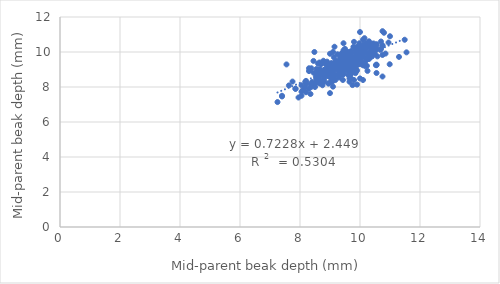
| Category | Mid-offspring beak depth (mm) |
|---|---|
| 10.1 | 10.7 |
| 9.55 | 9.78 |
| 9.4 | 9.48 |
| 10.25 | 9.6 |
| 10.13 | 10.27 |
| 9.7 | 9.5 |
| 9.05 | 9 |
| 7.4 | 7.46 |
| 9.0 | 7.65 |
| 8.65 | 8.63 |
| 9.63 | 9.81 |
| 9.9 | 9.4 |
| 9.55 | 9.48 |
| 9.05 | 8.75 |
| 8.35 | 7.6 |
| 10.1 | 10 |
| 10.1 | 10.09 |
| 9.9 | 9.74 |
| 10.23 | 9.64 |
| 10.0 | 8.49 |
| 10.55 | 10.15 |
| 10.45 | 10.28 |
| 9.2 | 9.2 |
| 10.2 | 10.01 |
| 8.95 | 9.03 |
| 10.05 | 9.94 |
| 10.2 | 10.5 |
| 9.5 | 9.7 |
| 9.93 | 10.02 |
| 9.95 | 10.04 |
| 10.05 | 9.43 |
| 8.75 | 8.1 |
| 9.2 | 9.5 |
| 10.15 | 9.9 |
| 9.8 | 9.48 |
| 10.7 | 10.18 |
| 10.5 | 10.16 |
| 9.55 | 9.08 |
| 10.55 | 10.39 |
| 10.48 | 9.9 |
| 8.65 | 8.4 |
| 10.7 | 10.6 |
| 9.1 | 8.75 |
| 9.4 | 9.46 |
| 10.3 | 9.6 |
| 9.65 | 9.6 |
| 9.5 | 9.95 |
| 9.7 | 10.05 |
| 10.53 | 10.16 |
| 9.95 | 10.1 |
| 10.1 | 9.83 |
| 9.75 | 9.46 |
| 10.05 | 9.7 |
| 9.9 | 9.82 |
| 10.0 | 10.34 |
| 9.1 | 8.02 |
| 9.45 | 9.65 |
| 9.25 | 9.87 |
| 9.5 | 9 |
| 10.0 | 11.14 |
| 10.53 | 9.25 |
| 9.9 | 8.14 |
| 10.4 | 10.23 |
| 8.95 | 8.7 |
| 9.4 | 9.8 |
| 10.95 | 10.54 |
| 10.75 | 11.19 |
| 10.1 | 9.85 |
| 8.05 | 8.1 |
| 9.1 | 9.3 |
| 9.55 | 9.34 |
| 9.05 | 9.19 |
| 10.2 | 9.52 |
| 10.0 | 9.36 |
| 10.55 | 8.8 |
| 10.75 | 8.6 |
| 8.18 | 8 |
| 9.7 | 8.5 |
| 8.8 | 8.3 |
| 10.75 | 10.38 |
| 9.3 | 8.54 |
| 9.7 | 8.94 |
| 9.6 | 10 |
| 9.75 | 9.76 |
| 9.6 | 9.45 |
| 10.45 | 9.89 |
| 11.0 | 10.9 |
| 10.85 | 9.91 |
| 10.15 | 9.39 |
| 10.35 | 9.86 |
| 10.4 | 9.74 |
| 9.95 | 9.9 |
| 9.1 | 9.09 |
| 10.1 | 9.69 |
| 9.85 | 10.24 |
| 9.63 | 8.9 |
| 9.48 | 9.67 |
| 9.0 | 8.93 |
| 9.25 | 9.3 |
| 9.1 | 8.67 |
| 9.25 | 9.15 |
| 9.2 | 9.23 |
| 9.95 | 9.59 |
| 8.65 | 9.03 |
| 9.8 | 9.58 |
| 9.4 | 8.97 |
| 9.0 | 8.57 |
| 8.55 | 8.47 |
| 8.75 | 8.71 |
| 9.65 | 9.21 |
| 8.95 | 9.13 |
| 9.15 | 8.5 |
| 9.85 | 9.58 |
| 10.23 | 9.21 |
| 9.83 | 9.6 |
| 10.0 | 9.32 |
| 9.43 | 8.7 |
| 10.4 | 10.46 |
| 9.88 | 9.29 |
| 8.95 | 9.24 |
| 8.9 | 9.45 |
| 9.35 | 9.35 |
| 10.43 | 10.19 |
| 10.0 | 9.91 |
| 10.18 | 9.18 |
| 9.88 | 9.89 |
| 9.88 | 9.6 |
| 9.15 | 10.3 |
| 9.45 | 9.45 |
| 9.03 | 8.79 |
| 9.7 | 9.2 |
| 9.7 | 8.8 |
| 10.05 | 9.69 |
| 10.3 | 10.61 |
| 9.6 | 9.6 |
| 10.0 | 9.9 |
| 9.8 | 9.26 |
| 10.05 | 10.2 |
| 8.75 | 8.79 |
| 10.55 | 9.28 |
| 9.7 | 8.83 |
| 10.0 | 9.76 |
| 9.85 | 10.2 |
| 9.8 | 9.43 |
| 9.18 | 9.4 |
| 9.65 | 9.9 |
| 9.55 | 9.5 |
| 9.9 | 8.95 |
| 11.55 | 9.98 |
| 11.3 | 9.72 |
| 10.4 | 9.86 |
| 10.8 | 11.1 |
| 9.8 | 9.14 |
| 10.45 | 10.49 |
| 10.0 | 9.75 |
| 10.75 | 10.35 |
| 9.35 | 9.73 |
| 10.75 | 9.83 |
| 9.18 | 8.69 |
| 9.65 | 9.58 |
| 8.8 | 8.42 |
| 10.55 | 9.25 |
| 10.68 | 10.12 |
| 9.95 | 9.31 |
| 9.55 | 9.99 |
| 8.83 | 8.59 |
| 9.7 | 8.74 |
| 9.85 | 8.79 |
| 9.8 | 9.6 |
| 9.55 | 9.52 |
| 9.28 | 8.93 |
| 10.33 | 10.23 |
| 9.15 | 9.35 |
| 9.35 | 9.35 |
| 9.15 | 9.09 |
| 9.65 | 9.04 |
| 10.58 | 9.75 |
| 9.98 | 10.5 |
| 9.55 | 9.09 |
| 9.2 | 9.05 |
| 9.93 | 9.54 |
| 9.2 | 9.3 |
| 9.3 | 9.06 |
| 8.78 | 8.7 |
| 9.33 | 9.32 |
| 9.18 | 8.4 |
| 9.33 | 8.67 |
| 8.98 | 8.6 |
| 9.7 | 9.53 |
| 9.5 | 9.77 |
| 10.23 | 9.65 |
| 10.03 | 9.43 |
| 8.2 | 8.35 |
| 8.2 | 8.26 |
| 9.55 | 9.5 |
| 9.05 | 8.6 |
| 9.6 | 9.57 |
| 9.6 | 9.14 |
| 10.15 | 10.79 |
| 9.88 | 8.91 |
| 10.49 | 9.93 |
| 11.49 | 10.7 |
| 10.99 | 9.3 |
| 9.7 | 9.93 |
| 9.65 | 9.51 |
| 9.35 | 9.44 |
| 10.05 | 10.05 |
| 10.1 | 10.13 |
| 9.9 | 9.24 |
| 8.95 | 8.21 |
| 9.3 | 8.9 |
| 9.95 | 9.34 |
| 9.45 | 8.77 |
| 9.5 | 9.4 |
| 8.45 | 8.82 |
| 8.8 | 8.83 |
| 8.53 | 8.6 |
| 9.38 | 9.5 |
| 10.2 | 10.2 |
| 7.63 | 8.09 |
| 8.38 | 9.07 |
| 9.25 | 9.29 |
| 9.4 | 9.1 |
| 10.55 | 10.19 |
| 8.9 | 9.25 |
| 8.8 | 8.98 |
| 9.0 | 9.02 |
| 8.58 | 8.6 |
| 8.58 | 8.25 |
| 9.6 | 8.7 |
| 9.38 | 9.9 |
| 9.6 | 9.65 |
| 9.95 | 9.45 |
| 9.6 | 9.38 |
| 10.2 | 10.4 |
| 9.85 | 9.96 |
| 9.63 | 9.46 |
| 9.03 | 8.26 |
| 10.38 | 10.05 |
| 10.25 | 8.92 |
| 9.3 | 9.5 |
| 9.5 | 9.43 |
| 9.55 | 8.97 |
| 8.55 | 8.44 |
| 9.05 | 8.92 |
| 9.9 | 10.3 |
| 9.8 | 8.4 |
| 9.75 | 9.37 |
| 10.25 | 9.91 |
| 9.1 | 10 |
| 9.65 | 9.21 |
| 10.3 | 9.95 |
| 8.9 | 8.84 |
| 9.95 | 9.82 |
| 9.5 | 9.5 |
| 9.78 | 10.29 |
| 9.43 | 8.4 |
| 7.75 | 8.31 |
| 7.55 | 9.29 |
| 9.1 | 8.86 |
| 9.6 | 9.4 |
| 9.58 | 9.62 |
| 8.95 | 8.62 |
| 9.65 | 8.3 |
| 9.65 | 9.8 |
| 9.65 | 8.48 |
| 9.53 | 9.61 |
| 9.85 | 9.5 |
| 9.05 | 9.37 |
| 9.3 | 8.74 |
| 8.9 | 9.31 |
| 9.45 | 9.5 |
| 10.0 | 9.49 |
| 9.85 | 9.74 |
| 9.25 | 9.2 |
| 10.1 | 9.24 |
| 9.13 | 9.7 |
| 9.65 | 9.64 |
| 9.1 | 9.2 |
| 8.05 | 7.5 |
| 7.4 | 7.5 |
| 8.85 | 8.7 |
| 9.08 | 8.31 |
| 9.0 | 9 |
| 9.7 | 9.74 |
| 8.7 | 9.31 |
| 9.45 | 10.5 |
| 9.7 | 9.3 |
| 8.35 | 8.12 |
| 8.85 | 9.34 |
| 9.7 | 9.72 |
| 9.45 | 9 |
| 10.3 | 9.65 |
| 10.0 | 9.9 |
| 10.45 | 10 |
| 9.45 | 10.1 |
| 8.5 | 8 |
| 8.3 | 9.07 |
| 10.0 | 9.75 |
| 9.23 | 9.33 |
| 9.75 | 8.11 |
| 9.15 | 9.36 |
| 9.55 | 9.74 |
| 9.0 | 9.9 |
| 9.28 | 9.23 |
| 9.35 | 9.7 |
| 8.95 | 8.2 |
| 9.88 | 9.35 |
| 8.45 | 9.49 |
| 8.6 | 9.34 |
| 9.7 | 8.87 |
| 8.55 | 9.03 |
| 9.05 | 9.07 |
| 9.6 | 9.43 |
| 8.65 | 8.2 |
| 9.2 | 9.19 |
| 8.95 | 9 |
| 9.6 | 9.2 |
| 9.15 | 9.06 |
| 9.4 | 9.81 |
| 8.95 | 8.89 |
| 9.95 | 9.4 |
| 10.55 | 10.45 |
| 9.7 | 9.64 |
| 8.85 | 9.03 |
| 8.8 | 8.71 |
| 10.0 | 9.91 |
| 9.05 | 8.33 |
| 8.2 | 8.2 |
| 8.1 | 7.83 |
| 7.25 | 7.14 |
| 8.3 | 8.91 |
| 9.15 | 9.18 |
| 8.6 | 8.8 |
| 9.5 | 9.9 |
| 8.05 | 7.73 |
| 9.43 | 9.25 |
| 9.3 | 8.7 |
| 9.8 | 9.5 |
| 9.3 | 9.3 |
| 9.85 | 9.05 |
| 9.5 | 10.18 |
| 8.65 | 8.85 |
| 9.83 | 9.24 |
| 9.0 | 9.15 |
| 10.45 | 9.98 |
| 9.1 | 8.77 |
| 9.55 | 9.8 |
| 9.05 | 8.65 |
| 10.0 | 10 |
| 9.35 | 8.81 |
| 8.38 | 8.01 |
| 8.3 | 7.9 |
| 8.8 | 9.41 |
| 10.1 | 10.18 |
| 9.5 | 9.55 |
| 9.75 | 9.08 |
| 10.1 | 8.4 |
| 9.58 | 9.75 |
| 9.43 | 8.9 |
| 9.65 | 9.07 |
| 8.73 | 9.35 |
| 9.03 | 8.9 |
| 8.5 | 8.19 |
| 8.95 | 8.65 |
| 9.3 | 9.19 |
| 8.85 | 8.9 |
| 8.95 | 9.28 |
| 9.8 | 10.58 |
| 9.5 | 9 |
| 8.65 | 9.4 |
| 9.1 | 8.91 |
| 9.4 | 9.93 |
| 8.48 | 10 |
| 9.35 | 9.37 |
| 7.95 | 7.4 |
| 9.35 | 9 |
| 8.58 | 8.8 |
| 9.05 | 9.18 |
| 8.18 | 8.3 |
| 9.85 | 10.08 |
| 7.85 | 7.9 |
| 9.85 | 9.96 |
| 10.1 | 10.4 |
| 9.35 | 9.65 |
| 8.85 | 8.8 |
| 8.75 | 8.65 |
| 9.63 | 9.7 |
| 9.25 | 9.23 |
| 9.55 | 9.43 |
| 10.33 | 9.93 |
| 8.55 | 8.47 |
| 9.68 | 9.55 |
| 9.15 | 9.28 |
| 9.0 | 8.85 |
| 9.65 | 8.9 |
| 8.6 | 8.75 |
| 8.8 | 8.63 |
| 9.0 | 9 |
| 9.95 | 9.43 |
| 8.4 | 8.28 |
| 9.35 | 9.23 |
| 10.3 | 10.4 |
| 9.05 | 9 |
| 9.98 | 9.8 |
| 9.98 | 9.77 |
| 8.65 | 8.97 |
| 8.73 | 8.37 |
| 8.2 | 7.7 |
| 7.85 | 7.9 |
| 8.78 | 9.5 |
| 8.5 | 8.2 |
| 9.4 | 8.8 |